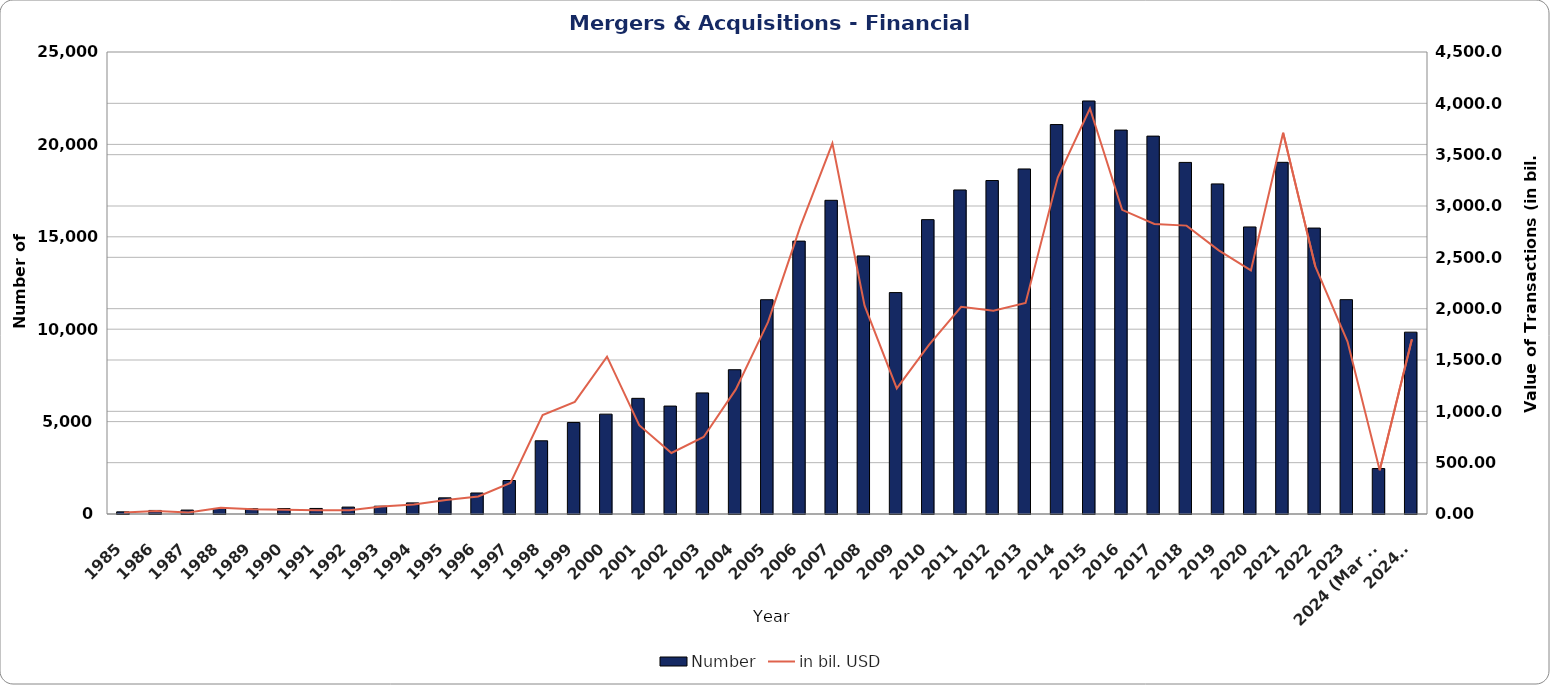
| Category | Number |
|---|---|
| 1985 | 117 |
| 1986 | 192 |
| 1987 | 213 |
| 1988 | 294 |
| 1989 | 286 |
| 1990 | 295 |
| 1991 | 301 |
| 1992 | 374 |
| 1993 | 422 |
| 1994 | 600 |
| 1995 | 875 |
| 1996 | 1137 |
| 1997 | 1812 |
| 1998 | 3962 |
| 1999 | 4949 |
| 2000 | 5403 |
| 2001 | 6259 |
| 2002 | 5840 |
| 2003 | 6552 |
| 2004 | 7807 |
| 2005 | 11595 |
| 2006 | 14766 |
| 2007 | 16975 |
| 2008 | 13966 |
| 2009 | 11981 |
| 2010 | 15929 |
| 2011 | 17535 |
| 2012 | 18045 |
| 2013 | 18671 |
| 2014 | 21074 |
| 2015 | 22350 |
| 2016 | 20775 |
| 2017 | 20448 |
| 2018 | 19025 |
| 2019 | 17862 |
| 2020 | 15533 |
| 2021 | 19030 |
| 2022 | 15473 |
| 2023 | 11598 |
| 2024 (Mar 31) | 2460 |
| 2024 e | 9840 |